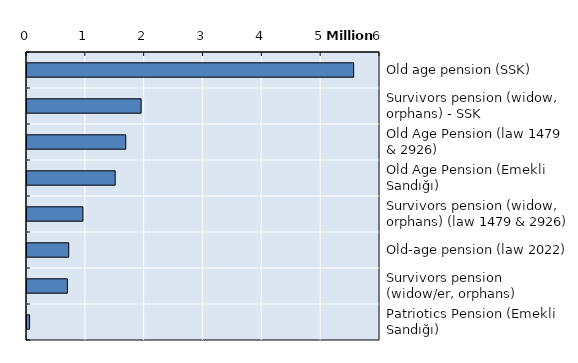
| Category | Series 0 |
|---|---|
| Old age pension (SSK) | 5552281 |
| Survivors pension (widow, orphans) - SSK | 1939548 |
| Old Age Pension (law 1479 & 2926) | 1678665 |
| Old Age Pension (Emekli Sandığı) | 1498812 |
| Survivors pension (widow, orphans) (law 1479 & 2926) | 950605 |
| Old-age pension (law 2022) | 709590 |
| Survivors pension (widow/er, orphans) | 685893 |
| Patriotics Pension (Emekli Sandığı) | 44256 |